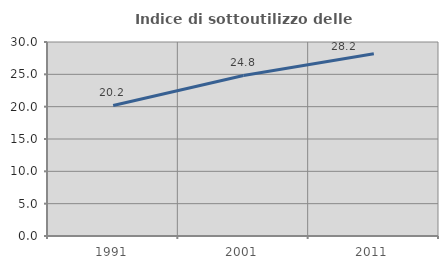
| Category | Indice di sottoutilizzo delle abitazioni  |
|---|---|
| 1991.0 | 20.18 |
| 2001.0 | 24.826 |
| 2011.0 | 28.169 |